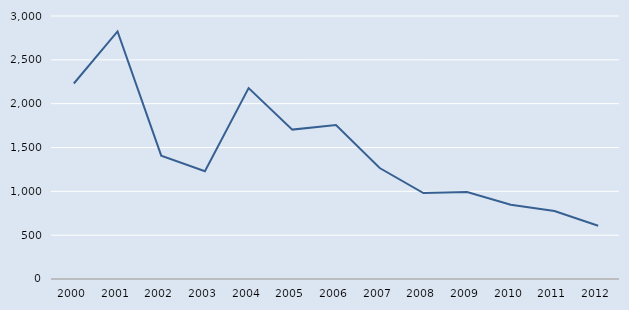
| Category | Series 0 |
|---|---|
| 2000.0 | 2230 |
| 2001.0 | 2824 |
| 2002.0 | 1407 |
| 2003.0 | 1229 |
| 2004.0 | 2178 |
| 2005.0 | 1704 |
| 2006.0 | 1756 |
| 2007.0 | 1266 |
| 2008.0 | 980 |
| 2009.0 | 993 |
| 2010.0 | 847 |
| 2011.0 | 775 |
| 2012.0 | 607 |